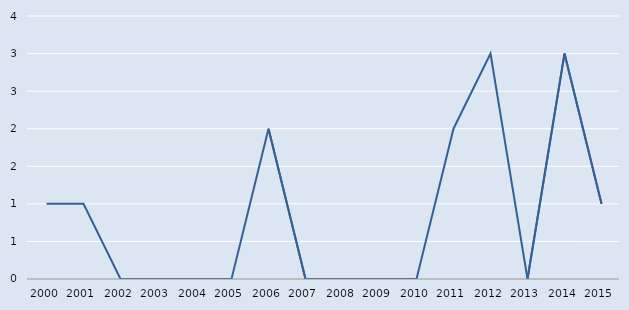
| Category | Series 0 |
|---|---|
| 2000.0 | 1 |
| 2001.0 | 1 |
| 2002.0 | 0 |
| 2003.0 | 0 |
| 2004.0 | 0 |
| 2005.0 | 0 |
| 2006.0 | 2 |
| 2007.0 | 0 |
| 2008.0 | 0 |
| 2009.0 | 0 |
| 2010.0 | 0 |
| 2011.0 | 2 |
| 2012.0 | 3 |
| 2013.0 | 0 |
| 2014.0 | 3 |
| 2015.0 | 1 |